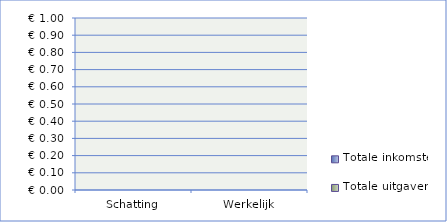
| Category | Totale inkomsten | Totale uitgaven |
|---|---|---|
| Schatting | 0 | 0 |
| Werkelijk | 0 | 0 |